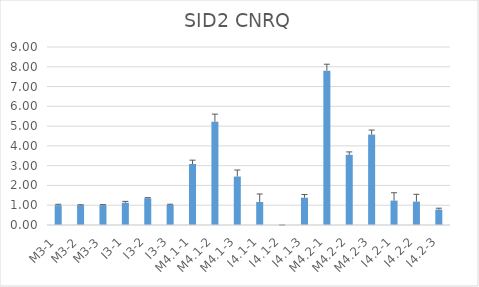
| Category | SID2 CNRQ |
|---|---|
| M3-1 | 1 |
| M3-2 | 1 |
| M3-3 | 1 |
| I3-1 | 1.124 |
| I3-2 | 1.351 |
| I3-3 | 1.01 |
| M4.1-1 | 3.084 |
| M4.1-2 | 5.222 |
| M4.1-3 | 2.45 |
| I4.1-1 | 1.164 |
| I4.1-2 | 0 |
| I4.1-3 | 1.38 |
| M4.2-1 | 7.803 |
| M4.2-2 | 3.547 |
| M4.2-3 | 4.57 |
| I4.2-1 | 1.233 |
| I4.2-2 | 1.182 |
| I4.2-3 | 0.78 |